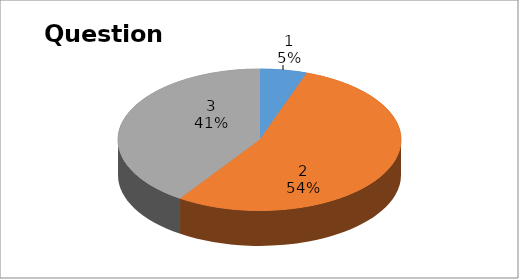
| Category | Series 0 |
|---|---|
| 0 | 2 |
| 1 | 20 |
| 2 | 15 |